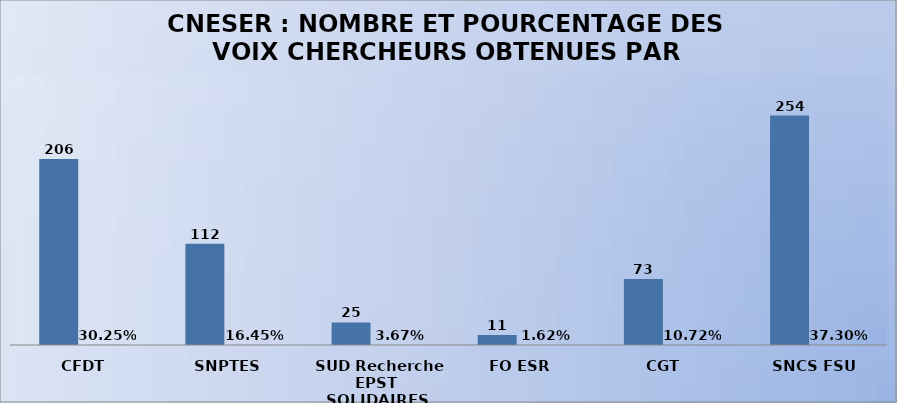
| Category | Series 0 | Series 1 |
|---|---|---|
|  CFDT | 206 | 0.302 |
| SNPTES | 112 | 0.164 |
|  SUD Recherche EPST SOLIDAIRES | 25 | 0.037 |
| FO ESR | 11 | 0.016 |
| CGT  | 73 | 0.107 |
|  SNCS FSU | 254 | 0.373 |